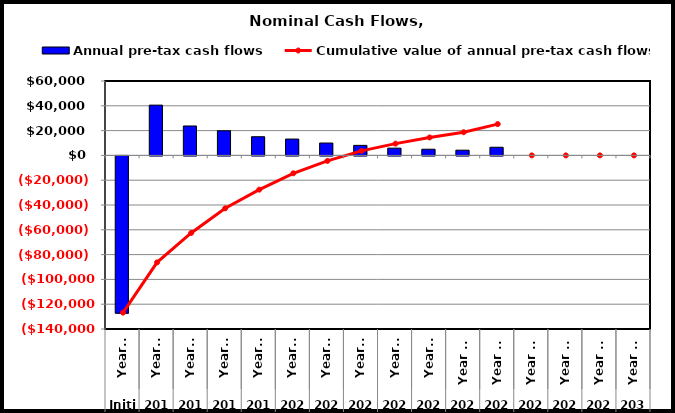
| Category | Annual pre-tax cash flows |
|---|---|
| 0 | -126812 |
| 1 | 40542.1 |
| 2 | 23734.095 |
| 3 | 19866.866 |
| 4 | 15062.987 |
| 5 | 13180.113 |
| 6 | 9976.617 |
| 7 | 8094.878 |
| 8 | 5845.123 |
| 9 | 4984.342 |
| 10 | 4209.327 |
| 11 | 6568.728 |
| 12 | 0 |
| 13 | 0 |
| 14 | 0 |
| 15 | 0 |